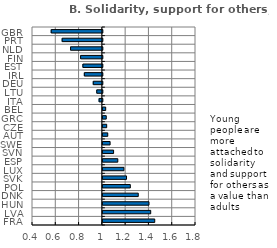
| Category | 2018 |
|---|---|
| FRA | 1.446 |
| LVA | 1.411 |
| HUN | 1.396 |
| DNK | 1.304 |
| POL | 1.236 |
| SVK | 1.203 |
| LUX | 1.181 |
| ESP | 1.128 |
| SVN | 1.092 |
| SWE | 1.062 |
| AUT | 1.042 |
| CZE | 1.033 |
| GRC | 1.029 |
| BEL | 1.024 |
| ITA | 0.972 |
| LTU | 0.952 |
| DEU | 0.922 |
| IRL | 0.845 |
| EST | 0.833 |
| FIN | 0.813 |
| NLD | 0.727 |
| PRT | 0.655 |
| GBR | 0.561 |